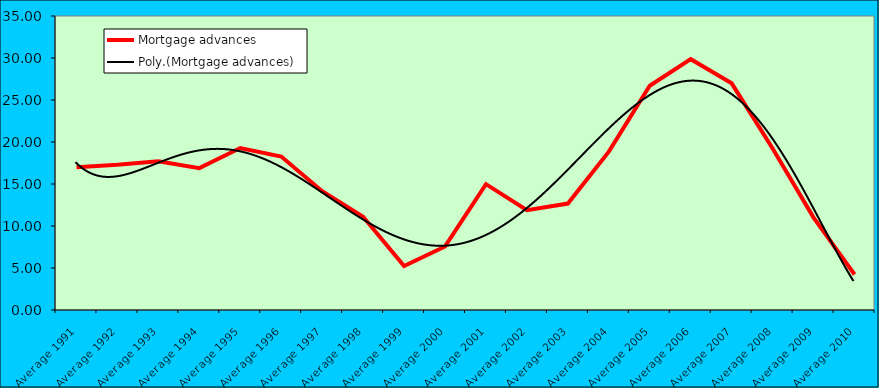
| Category | Mortgage advances |
|---|---|
| Average 1991 | 17.008 |
| Average 1992 | 17.288 |
| Average 1993 | 17.715 |
| Average 1994 | 16.887 |
| Average 1995 | 19.283 |
| Average 1996 | 18.264 |
| Average 1997 | 14.145 |
| Average 1998 | 11.109 |
| Average 1999 | 5.238 |
| Average 2000 | 7.564 |
| Average 2001 | 14.984 |
| Average 2002 | 11.888 |
| Average 2003 | 12.668 |
| Average 2004 | 18.854 |
| Average 2005 | 26.699 |
| Average 2006 | 29.863 |
| Average 2007 | 26.982 |
| Average 2008 | 19.234 |
| Average 2009 | 10.996 |
| Average 2010 | 4.225 |